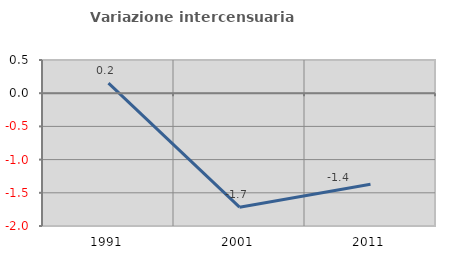
| Category | Variazione intercensuaria annua |
|---|---|
| 1991.0 | 0.151 |
| 2001.0 | -1.717 |
| 2011.0 | -1.37 |